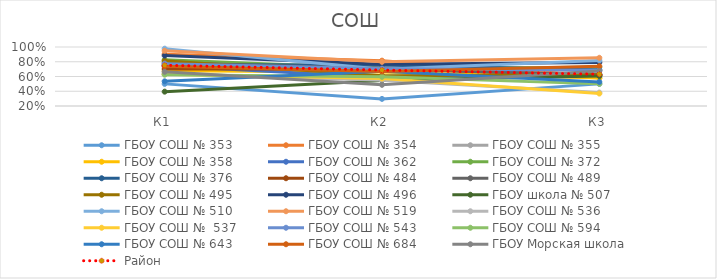
| Category | ГБОУ СОШ № 353 | ГБОУ СОШ № 354 | ГБОУ СОШ № 355 | ГБОУ СОШ № 358 | ГБОУ СОШ № 362 | ГБОУ СОШ № 372 | ГБОУ СОШ № 376 | ГБОУ СОШ № 484 | ГБОУ СОШ № 489 | ГБОУ СОШ № 495 | ГБОУ СОШ № 496 | ГБОУ школа № 507 | ГБОУ СОШ № 510 | ГБОУ СОШ № 519 | ГБОУ СОШ № 536 | ГБОУ СОШ №  537 | ГБОУ СОШ № 543 | ГБОУ СОШ № 594 | ГБОУ СОШ № 643 | ГБОУ СОШ № 684 | ГБОУ Морская школа | Район |
|---|---|---|---|---|---|---|---|---|---|---|---|---|---|---|---|---|---|---|---|---|---|---|
| К1 | 0.5 | 0.903 | 0.73 | 0.677 | 0.747 | 0.827 | 0.759 | 0.701 | 0.786 | 0.812 | 0.884 | 0.395 | 0.977 | 0.948 | 0.637 | 0.631 | 0.775 | 0.625 | 0.534 | 0.74 | 0.663 | 0.752 |
| К2 | 0.296 | 0.815 | 0.721 | 0.663 | 0.587 | 0.707 | 0.757 | 0.704 | 0.707 | 0.611 | 0.767 | 0.547 | 0.697 | 0.799 | 0.549 | 0.571 | 0.706 | 0.595 | 0.672 | 0.667 | 0.487 | 0.687 |
| К3 | 0.5 | 0.611 | 0.581 | 0.579 | 0.633 | 0.724 | 0.688 | 0.618 | 0.618 | 0.625 | 0.791 | 0.605 | 0.818 | 0.853 | 0.382 | 0.369 | 0.686 | 0.5 | 0.526 | 0.74 | 0.673 | 0.631 |